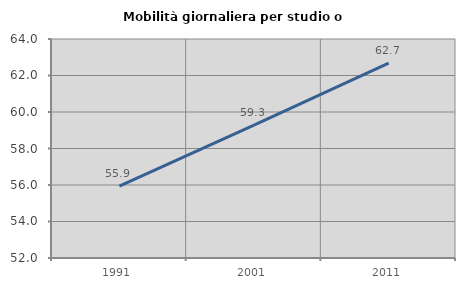
| Category | Mobilità giornaliera per studio o lavoro |
|---|---|
| 1991.0 | 55.932 |
| 2001.0 | 59.28 |
| 2011.0 | 62.679 |